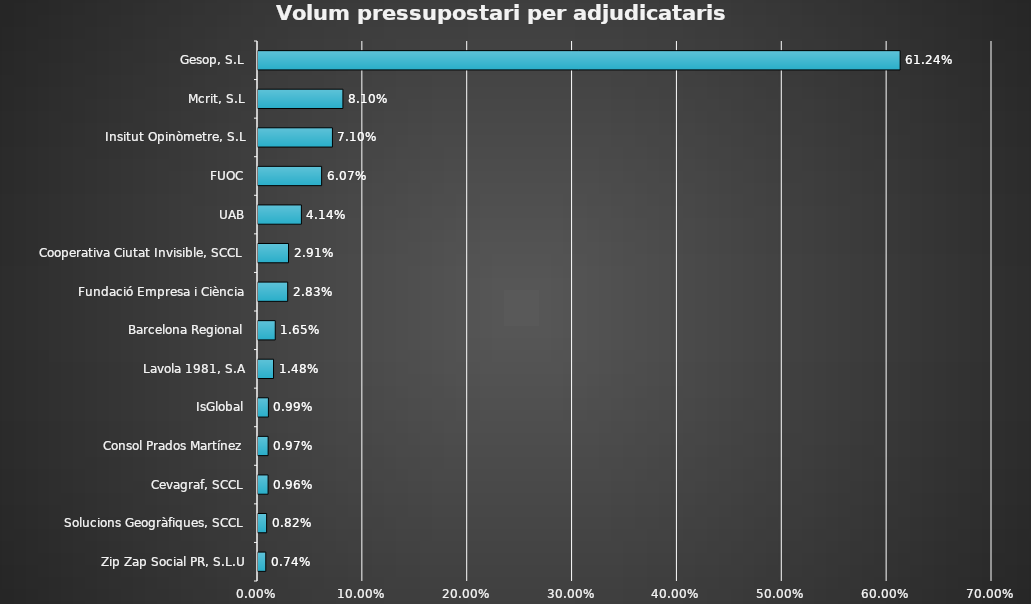
| Category | Series 0 |
|---|---|
| Zip Zap Social PR, S.L.U | 0.007 |
| Solucions Geogràfiques, SCCL | 0.008 |
| Cevagraf, SCCL | 0.01 |
| Consol Prados Martínez | 0.01 |
| IsGlobal | 0.01 |
| Lavola 1981, S.A | 0.015 |
| Barcelona Regional | 0.016 |
| Fundació Empresa i Ciència | 0.028 |
| Cooperativa Ciutat Invisible, SCCL | 0.029 |
| UAB | 0.041 |
| FUOC | 0.061 |
| Insitut Opinòmetre, S.L | 0.071 |
| Mcrit, S.L | 0.081 |
| Gesop, S.L | 0.612 |